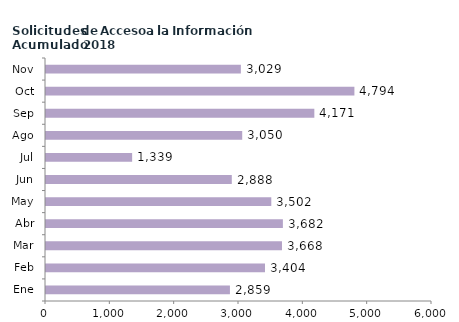
| Category | Series 0 |
|---|---|
| Ene | 2859 |
| Feb | 3404 |
| Mar | 3668 |
| Abr | 3682 |
| May | 3502 |
| Jun | 2888 |
| Jul | 1339 |
| Ago | 3050 |
| Sep | 4171 |
| Oct | 4794 |
| Nov | 3029 |